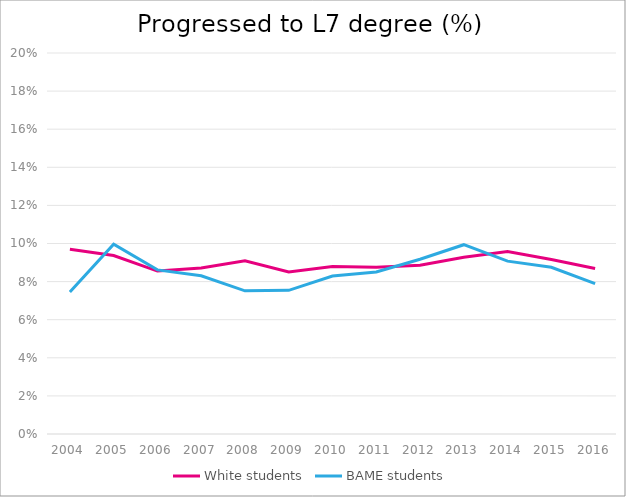
| Category | White students | BAME students |
|---|---|---|
| 2004.0 | 0.097 | 0.075 |
| 2005.0 | 0.094 | 0.1 |
| 2006.0 | 0.086 | 0.086 |
| 2007.0 | 0.087 | 0.083 |
| 2008.0 | 0.091 | 0.075 |
| 2009.0 | 0.085 | 0.075 |
| 2010.0 | 0.088 | 0.083 |
| 2011.0 | 0.088 | 0.085 |
| 2012.0 | 0.089 | 0.092 |
| 2013.0 | 0.093 | 0.099 |
| 2014.0 | 0.096 | 0.091 |
| 2015.0 | 0.092 | 0.088 |
| 2016.0 | 0.087 | 0.079 |